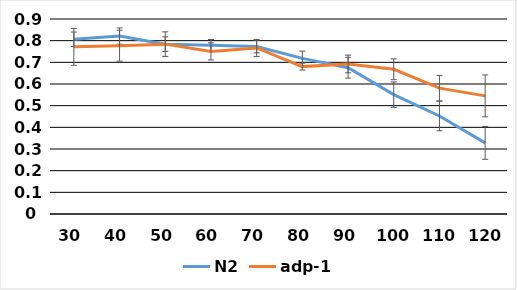
| Category | N2 | adp-1 |
|---|---|---|
| 30.0 | 0.806 | 0.772 |
| 40.0 | 0.821 | 0.777 |
| 50.0 | 0.784 | 0.784 |
| 60.0 | 0.779 | 0.75 |
| 70.0 | 0.773 | 0.766 |
| 80.0 | 0.718 | 0.68 |
| 90.0 | 0.675 | 0.692 |
| 100.0 | 0.551 | 0.668 |
| 110.0 | 0.452 | 0.581 |
| 120.0 | 0.328 | 0.545 |